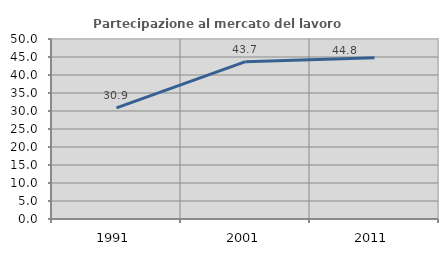
| Category | Partecipazione al mercato del lavoro  femminile |
|---|---|
| 1991.0 | 30.886 |
| 2001.0 | 43.703 |
| 2011.0 | 44.824 |